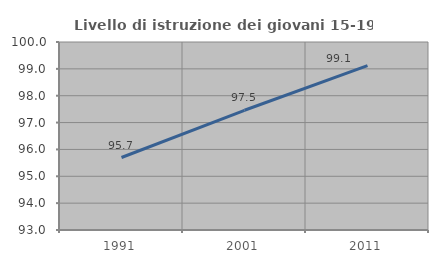
| Category | Livello di istruzione dei giovani 15-19 anni |
|---|---|
| 1991.0 | 95.699 |
| 2001.0 | 97.458 |
| 2011.0 | 99.123 |